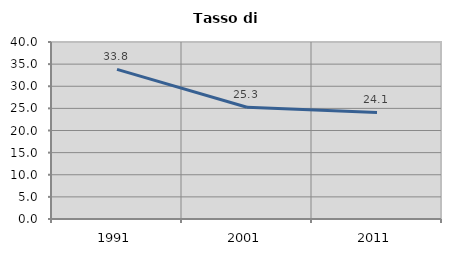
| Category | Tasso di disoccupazione   |
|---|---|
| 1991.0 | 33.803 |
| 2001.0 | 25.268 |
| 2011.0 | 24.091 |